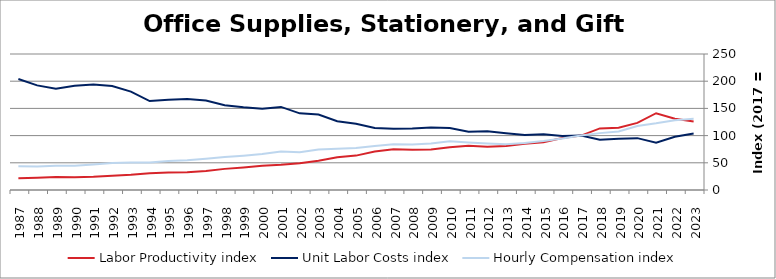
| Category | Labor Productivity index | Unit Labor Costs index | Hourly Compensation index |
|---|---|---|---|
| 2023.0 | 126.112 | 103.796 | 130.898 |
| 2022.0 | 130.994 | 97.93 | 128.283 |
| 2021.0 | 141.116 | 86.817 | 122.513 |
| 2020.0 | 123.329 | 95.342 | 117.584 |
| 2019.0 | 114.546 | 93.995 | 107.667 |
| 2018.0 | 113.216 | 92.35 | 104.555 |
| 2017.0 | 100 | 100 | 100 |
| 2016.0 | 95.402 | 99.435 | 94.863 |
| 2015.0 | 87.742 | 102.522 | 89.955 |
| 2014.0 | 85.194 | 101.31 | 86.309 |
| 2013.0 | 80.837 | 104.234 | 84.26 |
| 2012.0 | 79.315 | 107.896 | 85.578 |
| 2011.0 | 81.409 | 107.285 | 87.34 |
| 2010.0 | 78.516 | 114.043 | 89.541 |
| 2009.0 | 74.477 | 114.899 | 85.573 |
| 2008.0 | 74.042 | 113.163 | 83.788 |
| 2007.0 | 74.734 | 112.727 | 84.245 |
| 2006.0 | 70.941 | 114.169 | 80.993 |
| 2005.0 | 63.214 | 121.901 | 77.059 |
| 2004.0 | 60.125 | 126.42 | 76.009 |
| 2003.0 | 53.779 | 138.591 | 74.533 |
| 2002.0 | 49.362 | 140.888 | 69.545 |
| 2001.0 | 46.437 | 152.726 | 70.921 |
| 2000.0 | 44.388 | 149.139 | 66.2 |
| 1999.0 | 41.519 | 152.055 | 63.133 |
| 1998.0 | 38.832 | 155.88 | 60.532 |
| 1997.0 | 34.915 | 164.335 | 57.377 |
| 1996.0 | 32.709 | 167.07 | 54.647 |
| 1995.0 | 32.02 | 165.884 | 53.115 |
| 1994.0 | 30.993 | 163.419 | 50.649 |
| 1993.0 | 27.885 | 180.801 | 50.416 |
| 1992.0 | 26.032 | 190.98 | 49.715 |
| 1991.0 | 24.248 | 194.077 | 47.061 |
| 1990.0 | 23.249 | 191.673 | 44.561 |
| 1989.0 | 23.826 | 186.254 | 44.376 |
| 1988.0 | 22.415 | 192.291 | 43.102 |
| 1987.0 | 21.41 | 203.937 | 43.664 |